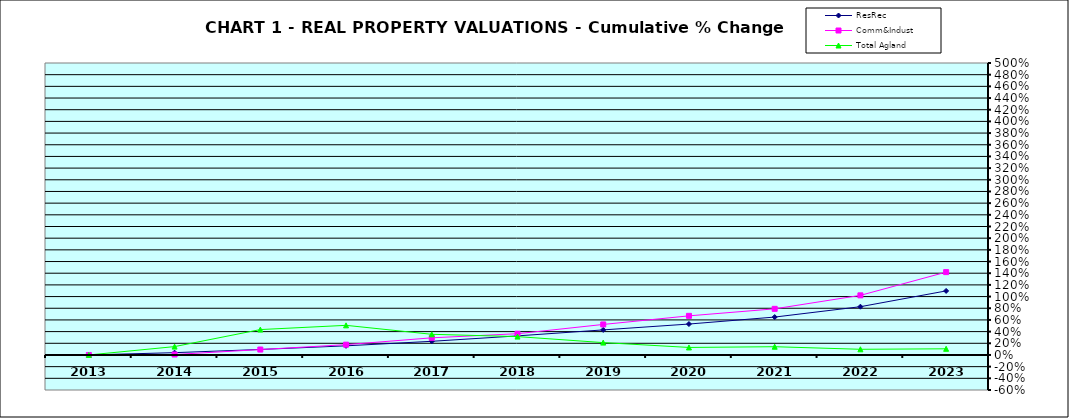
| Category | ResRec | Comm&Indust | Total Agland |
|---|---|---|---|
| 2013.0 | 0 | 0 | 0 |
| 2014.0 | 0.04 | 0.008 | 0.143 |
| 2015.0 | 0.094 | 0.093 | 0.435 |
| 2016.0 | 0.156 | 0.176 | 0.508 |
| 2017.0 | 0.234 | 0.293 | 0.354 |
| 2018.0 | 0.327 | 0.364 | 0.315 |
| 2019.0 | 0.429 | 0.523 | 0.212 |
| 2020.0 | 0.53 | 0.67 | 0.129 |
| 2021.0 | 0.649 | 0.79 | 0.141 |
| 2022.0 | 0.827 | 1.021 | 0.097 |
| 2023.0 | 1.097 | 1.419 | 0.105 |